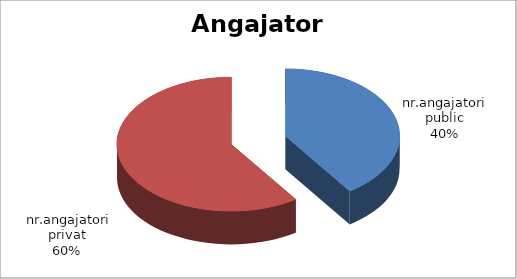
| Category | Series 0 |
|---|---|
|                                                                           nr.angajatori public | 1699 |
|                                                                             nr.angajatori privat | 2501 |